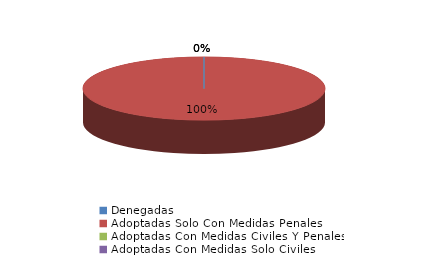
| Category | Series 0 |
|---|---|
| Denegadas | 0 |
| Adoptadas Solo Con Medidas Penales | 1 |
| Adoptadas Con Medidas Civiles Y Penales | 0 |
| Adoptadas Con Medidas Solo Civiles | 0 |